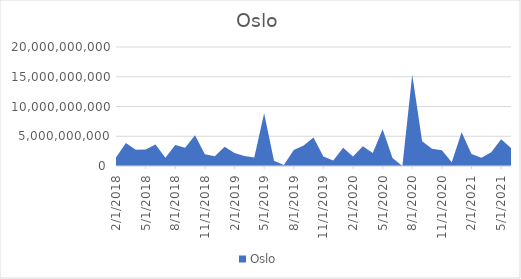
| Category | Oslo |
|---|---|
| 2/1/18 | 1434850000 |
| 3/1/18 | 3864800000 |
| 4/1/18 | 2712850000 |
| 5/1/18 | 2757200000 |
| 6/1/18 | 3617375000 |
| 7/1/18 | 1395900000 |
| 8/1/18 | 3536950000 |
| 9/1/18 | 3070850000 |
| 10/1/18 | 5167750000 |
| 11/1/18 | 1981000000 |
| 12/1/18 | 1633550000 |
| 1/1/19 | 3230000000 |
| 2/1/19 | 2165000000 |
| 3/1/19 | 1687000000 |
| 4/1/19 | 1424950000 |
| 5/1/19 | 8886050000 |
| 6/1/19 | 892300000 |
| 7/1/19 | 164670000 |
| 8/1/19 | 2684250000 |
| 9/1/19 | 3446500000 |
| 10/1/19 | 4771100000 |
| 11/1/19 | 1586450000 |
| 12/1/19 | 925500000 |
| 1/1/20 | 3047250000 |
| 2/1/20 | 1604200000 |
| 3/1/20 | 3328100000 |
| 4/1/20 | 2194900000 |
| 5/1/20 | 6182650000 |
| 6/1/20 | 1337050000 |
| 7/1/20 | 14450000 |
| 8/1/20 | 15324080000 |
| 9/1/20 | 4157250000 |
| 10/1/20 | 2890350000 |
| 11/1/20 | 2654500000 |
| 12/1/20 | 629450000 |
| 1/1/21 | 5682850000 |
| 2/1/21 | 1998350000 |
| 3/1/21 | 1390100000 |
| 4/1/21 | 2315150000 |
| 5/1/21 | 4492550000 |
| 6/1/21 | 3023940000 |